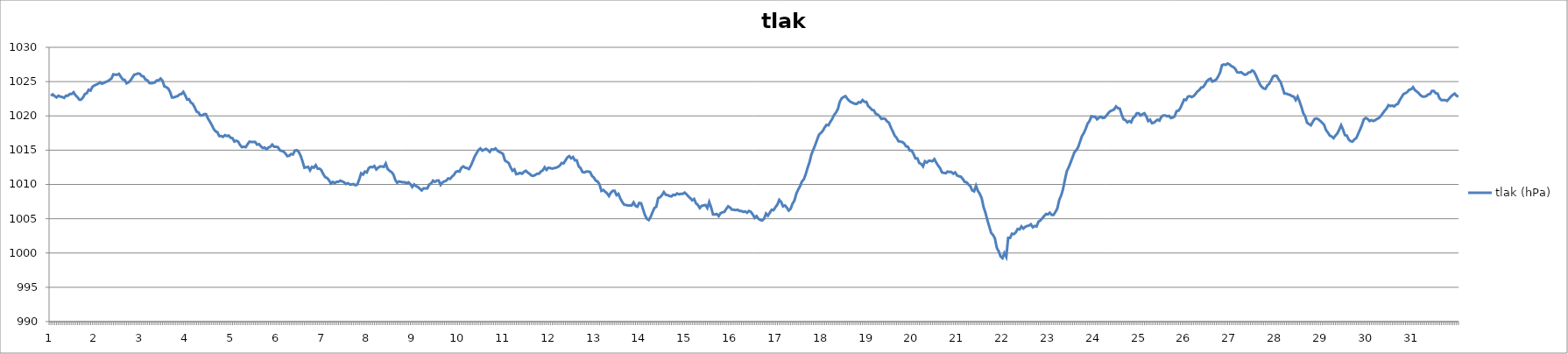
| Category | tlak (hPa) |
|---|---|
| 0 | 1022.94 |
| 1 | 1023.13 |
| 2 | 1022.88 |
| 3 | 1022.69 |
| 4 | 1022.94 |
| 5 | 1022.81 |
| 6 | 1022.75 |
| 7 | 1022.63 |
| 8 | 1022.94 |
| 9 | 1022.94 |
| 10 | 1023.19 |
| 11 | 1023.19 |
| 12 | 1023.44 |
| 13 | 1023 |
| 14 | 1022.75 |
| 15 | 1022.38 |
| 16 | 1022.38 |
| 17 | 1022.69 |
| 18 | 1023.19 |
| 19 | 1023.31 |
| 20 | 1023.81 |
| 21 | 1023.69 |
| 22 | 1024.25 |
| 23 | 1024.44 |
| 24 | 1024.56 |
| 25 | 1024.69 |
| 26 | 1024.88 |
| 27 | 1024.69 |
| 28 | 1024.81 |
| 29 | 1024.94 |
| 30 | 1025.06 |
| 31 | 1025.25 |
| 32 | 1025.44 |
| 33 | 1026.06 |
| 34 | 1026 |
| 35 | 1026 |
| 36 | 1026.13 |
| 37 | 1025.69 |
| 38 | 1025.31 |
| 39 | 1025.25 |
| 40 | 1024.75 |
| 41 | 1024.88 |
| 42 | 1025.13 |
| 43 | 1025.56 |
| 44 | 1026 |
| 45 | 1026.06 |
| 46 | 1026.19 |
| 47 | 1026.13 |
| 48 | 1025.81 |
| 49 | 1025.75 |
| 50 | 1025.31 |
| 51 | 1025.19 |
| 52 | 1024.81 |
| 53 | 1024.75 |
| 54 | 1024.81 |
| 55 | 1024.88 |
| 56 | 1025.19 |
| 57 | 1025.19 |
| 58 | 1025.44 |
| 59 | 1025.13 |
| 60 | 1024.31 |
| 61 | 1024.19 |
| 62 | 1024 |
| 63 | 1023.5 |
| 64 | 1022.69 |
| 65 | 1022.69 |
| 66 | 1022.81 |
| 67 | 1022.88 |
| 68 | 1023.13 |
| 69 | 1023.19 |
| 70 | 1023.5 |
| 71 | 1023 |
| 72 | 1022.38 |
| 73 | 1022.44 |
| 74 | 1021.94 |
| 75 | 1021.75 |
| 76 | 1021.25 |
| 77 | 1020.63 |
| 78 | 1020.5 |
| 79 | 1020.06 |
| 80 | 1020.06 |
| 81 | 1020.25 |
| 82 | 1020.25 |
| 83 | 1019.63 |
| 84 | 1019.19 |
| 85 | 1018.69 |
| 86 | 1018.13 |
| 87 | 1017.75 |
| 88 | 1017.63 |
| 89 | 1017.06 |
| 90 | 1017.06 |
| 91 | 1016.94 |
| 92 | 1017.19 |
| 93 | 1017.06 |
| 94 | 1017.13 |
| 95 | 1016.81 |
| 96 | 1016.75 |
| 97 | 1016.25 |
| 98 | 1016.38 |
| 99 | 1016.25 |
| 100 | 1015.75 |
| 101 | 1015.44 |
| 102 | 1015.5 |
| 103 | 1015.44 |
| 104 | 1015.88 |
| 105 | 1016.25 |
| 106 | 1016.19 |
| 107 | 1016.19 |
| 108 | 1016.19 |
| 109 | 1015.81 |
| 110 | 1015.88 |
| 111 | 1015.56 |
| 112 | 1015.31 |
| 113 | 1015.38 |
| 114 | 1015.13 |
| 115 | 1015.38 |
| 116 | 1015.5 |
| 117 | 1015.81 |
| 118 | 1015.5 |
| 119 | 1015.5 |
| 120 | 1015.44 |
| 121 | 1015 |
| 122 | 1014.88 |
| 123 | 1014.81 |
| 124 | 1014.5 |
| 125 | 1014.13 |
| 126 | 1014.19 |
| 127 | 1014.44 |
| 128 | 1014.38 |
| 129 | 1014.94 |
| 130 | 1015 |
| 131 | 1014.75 |
| 132 | 1014.19 |
| 133 | 1013.38 |
| 134 | 1012.44 |
| 135 | 1012.5 |
| 136 | 1012.56 |
| 137 | 1012.06 |
| 138 | 1012.56 |
| 139 | 1012.44 |
| 140 | 1012.81 |
| 141 | 1012.31 |
| 142 | 1012.31 |
| 143 | 1012.06 |
| 144 | 1011.5 |
| 145 | 1011.06 |
| 146 | 1010.94 |
| 147 | 1010.63 |
| 148 | 1010.13 |
| 149 | 1010.38 |
| 150 | 1010.19 |
| 151 | 1010.38 |
| 152 | 1010.38 |
| 153 | 1010.56 |
| 154 | 1010.44 |
| 155 | 1010.31 |
| 156 | 1010.06 |
| 157 | 1010.19 |
| 158 | 1010 |
| 159 | 1010 |
| 160 | 1010.06 |
| 161 | 1009.88 |
| 162 | 1010 |
| 163 | 1010.75 |
| 164 | 1011.63 |
| 165 | 1011.44 |
| 166 | 1011.88 |
| 167 | 1011.75 |
| 168 | 1012.38 |
| 169 | 1012.56 |
| 170 | 1012.5 |
| 171 | 1012.69 |
| 172 | 1012.19 |
| 173 | 1012.44 |
| 174 | 1012.63 |
| 175 | 1012.63 |
| 176 | 1012.56 |
| 177 | 1013.06 |
| 178 | 1012.25 |
| 179 | 1012 |
| 180 | 1011.81 |
| 181 | 1011.5 |
| 182 | 1010.69 |
| 183 | 1010.25 |
| 184 | 1010.44 |
| 185 | 1010.38 |
| 186 | 1010.31 |
| 187 | 1010.31 |
| 188 | 1010.19 |
| 189 | 1010.31 |
| 190 | 1010.06 |
| 191 | 1009.63 |
| 192 | 1010 |
| 193 | 1009.75 |
| 194 | 1009.63 |
| 195 | 1009.38 |
| 196 | 1009.13 |
| 197 | 1009.44 |
| 198 | 1009.44 |
| 199 | 1009.44 |
| 200 | 1010 |
| 201 | 1010.13 |
| 202 | 1010.56 |
| 203 | 1010.38 |
| 204 | 1010.56 |
| 205 | 1010.56 |
| 206 | 1009.94 |
| 207 | 1010.31 |
| 208 | 1010.44 |
| 209 | 1010.56 |
| 210 | 1010.88 |
| 211 | 1010.81 |
| 212 | 1011.13 |
| 213 | 1011.38 |
| 214 | 1011.81 |
| 215 | 1011.94 |
| 216 | 1011.88 |
| 217 | 1012.44 |
| 218 | 1012.63 |
| 219 | 1012.44 |
| 220 | 1012.38 |
| 221 | 1012.25 |
| 222 | 1012.75 |
| 223 | 1013.38 |
| 224 | 1014.06 |
| 225 | 1014.56 |
| 226 | 1015 |
| 227 | 1015.25 |
| 228 | 1014.94 |
| 229 | 1015.06 |
| 230 | 1015.19 |
| 231 | 1015 |
| 232 | 1014.75 |
| 233 | 1015.13 |
| 234 | 1015.06 |
| 235 | 1015.25 |
| 236 | 1014.94 |
| 237 | 1014.75 |
| 238 | 1014.63 |
| 239 | 1014.44 |
| 240 | 1013.5 |
| 241 | 1013.31 |
| 242 | 1013.13 |
| 243 | 1012.5 |
| 244 | 1012 |
| 245 | 1012.19 |
| 246 | 1011.5 |
| 247 | 1011.56 |
| 248 | 1011.69 |
| 249 | 1011.56 |
| 250 | 1011.81 |
| 251 | 1012 |
| 252 | 1011.75 |
| 253 | 1011.56 |
| 254 | 1011.31 |
| 255 | 1011.25 |
| 256 | 1011.38 |
| 257 | 1011.56 |
| 258 | 1011.56 |
| 259 | 1011.88 |
| 260 | 1012.06 |
| 261 | 1012.5 |
| 262 | 1012.13 |
| 263 | 1012.44 |
| 264 | 1012.38 |
| 265 | 1012.31 |
| 266 | 1012.38 |
| 267 | 1012.44 |
| 268 | 1012.56 |
| 269 | 1012.75 |
| 270 | 1013.13 |
| 271 | 1013.06 |
| 272 | 1013.5 |
| 273 | 1013.94 |
| 274 | 1014.13 |
| 275 | 1013.81 |
| 276 | 1014 |
| 277 | 1013.5 |
| 278 | 1013.5 |
| 279 | 1012.63 |
| 280 | 1012.38 |
| 281 | 1011.81 |
| 282 | 1011.75 |
| 283 | 1011.88 |
| 284 | 1011.88 |
| 285 | 1011.81 |
| 286 | 1011.25 |
| 287 | 1011 |
| 288 | 1010.56 |
| 289 | 1010.44 |
| 290 | 1010 |
| 291 | 1009.06 |
| 292 | 1009.19 |
| 293 | 1008.94 |
| 294 | 1008.69 |
| 295 | 1008.31 |
| 296 | 1008.81 |
| 297 | 1009.06 |
| 298 | 1009.06 |
| 299 | 1008.44 |
| 300 | 1008.63 |
| 301 | 1007.94 |
| 302 | 1007.44 |
| 303 | 1007.06 |
| 304 | 1007 |
| 305 | 1006.94 |
| 306 | 1006.94 |
| 307 | 1006.94 |
| 308 | 1007.38 |
| 309 | 1006.88 |
| 310 | 1006.75 |
| 311 | 1007.31 |
| 312 | 1007.25 |
| 313 | 1006.38 |
| 314 | 1005.56 |
| 315 | 1005 |
| 316 | 1004.81 |
| 317 | 1005.25 |
| 318 | 1005.94 |
| 319 | 1006.56 |
| 320 | 1006.75 |
| 321 | 1008 |
| 322 | 1008.13 |
| 323 | 1008.44 |
| 324 | 1008.88 |
| 325 | 1008.5 |
| 326 | 1008.44 |
| 327 | 1008.31 |
| 328 | 1008.25 |
| 329 | 1008.5 |
| 330 | 1008.44 |
| 331 | 1008.69 |
| 332 | 1008.56 |
| 333 | 1008.63 |
| 334 | 1008.63 |
| 335 | 1008.81 |
| 336 | 1008.56 |
| 337 | 1008.25 |
| 338 | 1008 |
| 339 | 1007.69 |
| 340 | 1007.88 |
| 341 | 1007.25 |
| 342 | 1007 |
| 343 | 1006.56 |
| 344 | 1006.88 |
| 345 | 1006.94 |
| 346 | 1007 |
| 347 | 1006.56 |
| 348 | 1007.44 |
| 349 | 1006.63 |
| 350 | 1005.63 |
| 351 | 1005.63 |
| 352 | 1005.69 |
| 353 | 1005.38 |
| 354 | 1005.81 |
| 355 | 1005.94 |
| 356 | 1006 |
| 357 | 1006.44 |
| 358 | 1006.81 |
| 359 | 1006.63 |
| 360 | 1006.31 |
| 361 | 1006.31 |
| 362 | 1006.25 |
| 363 | 1006.31 |
| 364 | 1006.13 |
| 365 | 1006.13 |
| 366 | 1006 |
| 367 | 1006.06 |
| 368 | 1005.88 |
| 369 | 1006.13 |
| 370 | 1006 |
| 371 | 1005.63 |
| 372 | 1005.13 |
| 373 | 1005.38 |
| 374 | 1005 |
| 375 | 1004.81 |
| 376 | 1004.75 |
| 377 | 1005 |
| 378 | 1005.75 |
| 379 | 1005.44 |
| 380 | 1005.88 |
| 381 | 1006.31 |
| 382 | 1006.25 |
| 383 | 1006.69 |
| 384 | 1007.06 |
| 385 | 1007.75 |
| 386 | 1007.44 |
| 387 | 1006.81 |
| 388 | 1006.94 |
| 389 | 1006.63 |
| 390 | 1006.19 |
| 391 | 1006.44 |
| 392 | 1007.19 |
| 393 | 1007.63 |
| 394 | 1008.63 |
| 395 | 1009.25 |
| 396 | 1009.75 |
| 397 | 1010.44 |
| 398 | 1010.75 |
| 399 | 1011.5 |
| 400 | 1012.44 |
| 401 | 1013.25 |
| 402 | 1014.38 |
| 403 | 1015.06 |
| 404 | 1015.75 |
| 405 | 1016.5 |
| 406 | 1017.25 |
| 407 | 1017.5 |
| 408 | 1017.81 |
| 409 | 1018.31 |
| 410 | 1018.69 |
| 411 | 1018.63 |
| 412 | 1019.13 |
| 413 | 1019.56 |
| 414 | 1020.13 |
| 415 | 1020.5 |
| 416 | 1021 |
| 417 | 1022.06 |
| 418 | 1022.56 |
| 419 | 1022.75 |
| 420 | 1022.88 |
| 421 | 1022.5 |
| 422 | 1022.19 |
| 423 | 1022 |
| 424 | 1021.88 |
| 425 | 1021.75 |
| 426 | 1021.75 |
| 427 | 1022 |
| 428 | 1021.94 |
| 429 | 1022.31 |
| 430 | 1022.06 |
| 431 | 1022.06 |
| 432 | 1021.44 |
| 433 | 1021.19 |
| 434 | 1020.88 |
| 435 | 1020.81 |
| 436 | 1020.31 |
| 437 | 1020.19 |
| 438 | 1019.94 |
| 439 | 1019.56 |
| 440 | 1019.63 |
| 441 | 1019.56 |
| 442 | 1019.19 |
| 443 | 1019 |
| 444 | 1018.31 |
| 445 | 1017.75 |
| 446 | 1017.13 |
| 447 | 1016.81 |
| 448 | 1016.31 |
| 449 | 1016.25 |
| 450 | 1016.19 |
| 451 | 1016 |
| 452 | 1015.56 |
| 453 | 1015.5 |
| 454 | 1014.94 |
| 455 | 1014.94 |
| 456 | 1014.44 |
| 457 | 1013.81 |
| 458 | 1013.81 |
| 459 | 1013.13 |
| 460 | 1013 |
| 461 | 1012.63 |
| 462 | 1013.38 |
| 463 | 1013.19 |
| 464 | 1013.44 |
| 465 | 1013.44 |
| 466 | 1013.38 |
| 467 | 1013.69 |
| 468 | 1013.19 |
| 469 | 1012.75 |
| 470 | 1012.38 |
| 471 | 1011.75 |
| 472 | 1011.69 |
| 473 | 1011.63 |
| 474 | 1011.88 |
| 475 | 1011.81 |
| 476 | 1011.81 |
| 477 | 1011.56 |
| 478 | 1011.75 |
| 479 | 1011.31 |
| 480 | 1011.19 |
| 481 | 1011.13 |
| 482 | 1010.81 |
| 483 | 1010.38 |
| 484 | 1010.31 |
| 485 | 1010 |
| 486 | 1009.75 |
| 487 | 1009.13 |
| 488 | 1009 |
| 489 | 1009.81 |
| 490 | 1009.06 |
| 491 | 1008.63 |
| 492 | 1008 |
| 493 | 1006.69 |
| 494 | 1005.88 |
| 495 | 1004.81 |
| 496 | 1003.88 |
| 497 | 1002.94 |
| 498 | 1002.63 |
| 499 | 1002.13 |
| 500 | 1000.75 |
| 501 | 1000.25 |
| 502 | 999.5 |
| 503 | 999.25 |
| 504 | 1000 |
| 505 | 999.44 |
| 506 | 1002.19 |
| 507 | 1002.19 |
| 508 | 1002.81 |
| 509 | 1002.75 |
| 510 | 1003 |
| 511 | 1003.5 |
| 512 | 1003.44 |
| 513 | 1003.88 |
| 514 | 1003.56 |
| 515 | 1003.81 |
| 516 | 1003.94 |
| 517 | 1004 |
| 518 | 1004.19 |
| 519 | 1003.75 |
| 520 | 1003.94 |
| 521 | 1003.88 |
| 522 | 1004.56 |
| 523 | 1004.75 |
| 524 | 1005.06 |
| 525 | 1005.38 |
| 526 | 1005.69 |
| 527 | 1005.63 |
| 528 | 1005.88 |
| 529 | 1005.56 |
| 530 | 1005.56 |
| 531 | 1006 |
| 532 | 1006.5 |
| 533 | 1007.75 |
| 534 | 1008.38 |
| 535 | 1009.31 |
| 536 | 1010.69 |
| 537 | 1011.94 |
| 538 | 1012.5 |
| 539 | 1013.19 |
| 540 | 1013.94 |
| 541 | 1014.69 |
| 542 | 1015 |
| 543 | 1015.44 |
| 544 | 1016.25 |
| 545 | 1017.06 |
| 546 | 1017.5 |
| 547 | 1018.13 |
| 548 | 1018.88 |
| 549 | 1019.25 |
| 550 | 1019.94 |
| 551 | 1019.88 |
| 552 | 1019.88 |
| 553 | 1019.5 |
| 554 | 1019.75 |
| 555 | 1019.88 |
| 556 | 1019.69 |
| 557 | 1019.75 |
| 558 | 1020.06 |
| 559 | 1020.44 |
| 560 | 1020.69 |
| 561 | 1020.81 |
| 562 | 1020.94 |
| 563 | 1021.38 |
| 564 | 1021.13 |
| 565 | 1021.06 |
| 566 | 1020.19 |
| 567 | 1019.5 |
| 568 | 1019.38 |
| 569 | 1019.06 |
| 570 | 1019.25 |
| 571 | 1019.06 |
| 572 | 1019.69 |
| 573 | 1019.94 |
| 574 | 1020.38 |
| 575 | 1020.38 |
| 576 | 1020.06 |
| 577 | 1020.25 |
| 578 | 1020.38 |
| 579 | 1019.94 |
| 580 | 1019.25 |
| 581 | 1019.44 |
| 582 | 1018.94 |
| 583 | 1019 |
| 584 | 1019.25 |
| 585 | 1019.44 |
| 586 | 1019.31 |
| 587 | 1019.88 |
| 588 | 1020.06 |
| 589 | 1020.06 |
| 590 | 1019.94 |
| 591 | 1020 |
| 592 | 1019.69 |
| 593 | 1019.75 |
| 594 | 1019.94 |
| 595 | 1020.69 |
| 596 | 1020.75 |
| 597 | 1021.13 |
| 598 | 1021.75 |
| 599 | 1022.38 |
| 600 | 1022.31 |
| 601 | 1022.81 |
| 602 | 1022.88 |
| 603 | 1022.75 |
| 604 | 1022.88 |
| 605 | 1023.19 |
| 606 | 1023.56 |
| 607 | 1023.75 |
| 608 | 1024.13 |
| 609 | 1024.19 |
| 610 | 1024.56 |
| 611 | 1025.06 |
| 612 | 1025.31 |
| 613 | 1025.44 |
| 614 | 1025 |
| 615 | 1025.13 |
| 616 | 1025.31 |
| 617 | 1025.75 |
| 618 | 1026.31 |
| 619 | 1027.38 |
| 620 | 1027.5 |
| 621 | 1027.44 |
| 622 | 1027.63 |
| 623 | 1027.5 |
| 624 | 1027.25 |
| 625 | 1027.13 |
| 626 | 1026.88 |
| 627 | 1026.38 |
| 628 | 1026.31 |
| 629 | 1026.38 |
| 630 | 1026.19 |
| 631 | 1026 |
| 632 | 1026.06 |
| 633 | 1026.31 |
| 634 | 1026.38 |
| 635 | 1026.63 |
| 636 | 1026.44 |
| 637 | 1025.88 |
| 638 | 1025.25 |
| 639 | 1024.63 |
| 640 | 1024.25 |
| 641 | 1024 |
| 642 | 1023.94 |
| 643 | 1024.44 |
| 644 | 1024.69 |
| 645 | 1025.19 |
| 646 | 1025.75 |
| 647 | 1025.88 |
| 648 | 1025.81 |
| 649 | 1025.31 |
| 650 | 1024.94 |
| 651 | 1024.13 |
| 652 | 1023.25 |
| 653 | 1023.25 |
| 654 | 1023.13 |
| 655 | 1023.06 |
| 656 | 1022.88 |
| 657 | 1022.81 |
| 658 | 1022.31 |
| 659 | 1022.81 |
| 660 | 1022.13 |
| 661 | 1021.31 |
| 662 | 1020.38 |
| 663 | 1019.94 |
| 664 | 1019 |
| 665 | 1018.81 |
| 666 | 1018.63 |
| 667 | 1019.13 |
| 668 | 1019.56 |
| 669 | 1019.63 |
| 670 | 1019.5 |
| 671 | 1019.25 |
| 672 | 1019 |
| 673 | 1018.69 |
| 674 | 1017.94 |
| 675 | 1017.56 |
| 676 | 1017.13 |
| 677 | 1017 |
| 678 | 1016.75 |
| 679 | 1017.13 |
| 680 | 1017.44 |
| 681 | 1018 |
| 682 | 1018.63 |
| 683 | 1018 |
| 684 | 1017.19 |
| 685 | 1017.13 |
| 686 | 1016.56 |
| 687 | 1016.31 |
| 688 | 1016.25 |
| 689 | 1016.56 |
| 690 | 1016.75 |
| 691 | 1017.38 |
| 692 | 1018 |
| 693 | 1018.69 |
| 694 | 1019.5 |
| 695 | 1019.69 |
| 696 | 1019.56 |
| 697 | 1019.25 |
| 698 | 1019.38 |
| 699 | 1019.25 |
| 700 | 1019.38 |
| 701 | 1019.56 |
| 702 | 1019.69 |
| 703 | 1020 |
| 704 | 1020.38 |
| 705 | 1020.75 |
| 706 | 1021.06 |
| 707 | 1021.56 |
| 708 | 1021.44 |
| 709 | 1021.5 |
| 710 | 1021.38 |
| 711 | 1021.63 |
| 712 | 1021.75 |
| 713 | 1022.31 |
| 714 | 1022.75 |
| 715 | 1023.19 |
| 716 | 1023.31 |
| 717 | 1023.5 |
| 718 | 1023.81 |
| 719 | 1023.88 |
| 720 | 1024.19 |
| 721 | 1023.75 |
| 722 | 1023.56 |
| 723 | 1023.31 |
| 724 | 1023 |
| 725 | 1022.81 |
| 726 | 1022.81 |
| 727 | 1022.88 |
| 728 | 1023.13 |
| 729 | 1023.19 |
| 730 | 1023.63 |
| 731 | 1023.63 |
| 732 | 1023.31 |
| 733 | 1023.25 |
| 734 | 1022.56 |
| 735 | 1022.31 |
| 736 | 1022.31 |
| 737 | 1022.31 |
| 738 | 1022.19 |
| 739 | 1022.5 |
| 740 | 1022.81 |
| 741 | 1023.06 |
| 742 | 1023.25 |
| 743 | 1022.94 |
| 744 | 1022.81 |